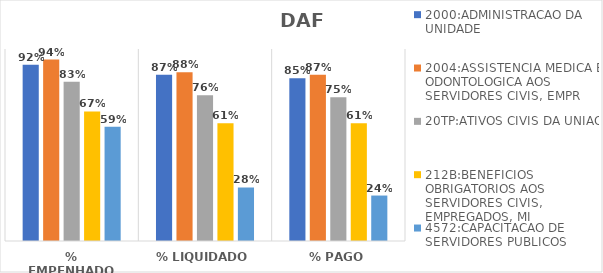
| Category | 2000:ADMINISTRACAO DA UNIDADE | 2004:ASSISTENCIA MEDICA E ODONTOLOGICA AOS SERVIDORES CIVIS, EMPR | 20TP:ATIVOS CIVIS DA UNIAO | 212B:BENEFICIOS OBRIGATORIOS AOS SERVIDORES CIVIS, EMPREGADOS, MI | 4572:CAPACITACAO DE SERVIDORES PUBLICOS FEDERAIS EM PROCESSO DE Q |
|---|---|---|---|---|---|
| % EMPENHADO | 0.918 | 0.945 | 0.83 | 0.675 | 0.594 |
| % LIQUIDADO | 0.866 | 0.879 | 0.759 | 0.614 | 0.279 |
| % PAGO | 0.847 | 0.866 | 0.748 | 0.613 | 0.237 |